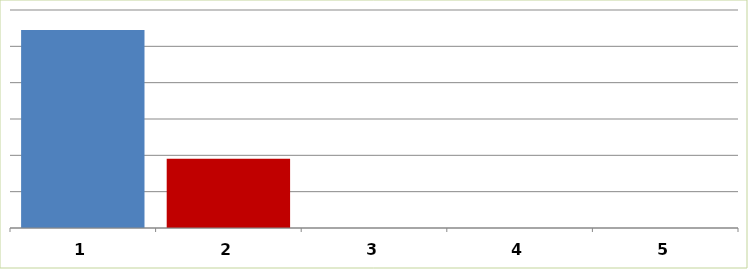
| Category | Series 0 |
|---|---|
| 0 | 54505028.99 |
| 1 | 19085000 |
| 2 | 0 |
| 3 | 0 |
| 4 | 0 |